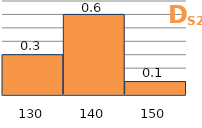
| Category | Series 1 |
|---|---|
| 130.0 | 0.3 |
| 140.0 | 0.6 |
| 150.0 | 0.1 |